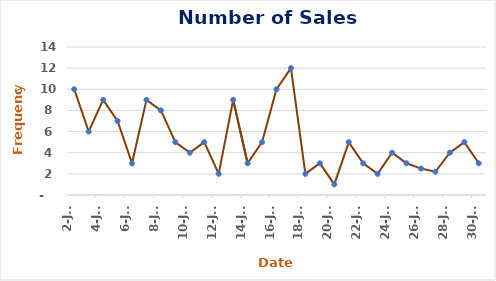
| Category | Series 0 |
|---|---|
| 2002-01-02 | 10 |
| 2002-01-03 | 6 |
| 2002-01-04 | 9 |
| 2002-01-05 | 7 |
| 2002-01-06 | 3 |
| 2002-01-07 | 9 |
| 2002-01-08 | 8 |
| 2002-01-09 | 5 |
| 2002-01-10 | 4 |
| 2002-01-11 | 5 |
| 2002-01-12 | 2 |
| 2002-01-13 | 9 |
| 2002-01-14 | 3 |
| 2002-01-15 | 5 |
| 2002-01-16 | 10 |
| 2002-01-17 | 12 |
| 2002-01-18 | 2 |
| 2002-01-19 | 3 |
| 2002-01-20 | 1 |
| 2002-01-21 | 5 |
| 2002-01-22 | 3 |
| 2002-01-23 | 2 |
| 2002-01-24 | 4 |
| 2002-01-25 | 3 |
| 2002-01-26 | 2.5 |
| 2002-01-27 | 2.2 |
| 2002-01-28 | 4 |
| 2002-01-29 | 5 |
| 2002-01-30 | 3 |